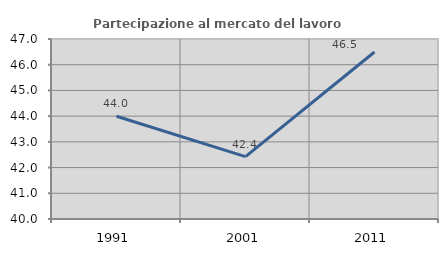
| Category | Partecipazione al mercato del lavoro  femminile |
|---|---|
| 1991.0 | 43.997 |
| 2001.0 | 42.424 |
| 2011.0 | 46.495 |